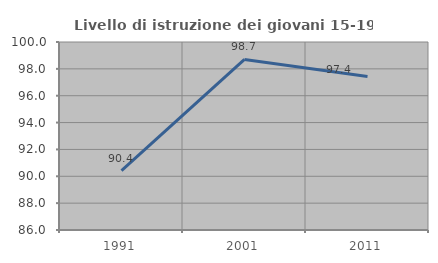
| Category | Livello di istruzione dei giovani 15-19 anni |
|---|---|
| 1991.0 | 90.426 |
| 2001.0 | 98.701 |
| 2011.0 | 97.436 |